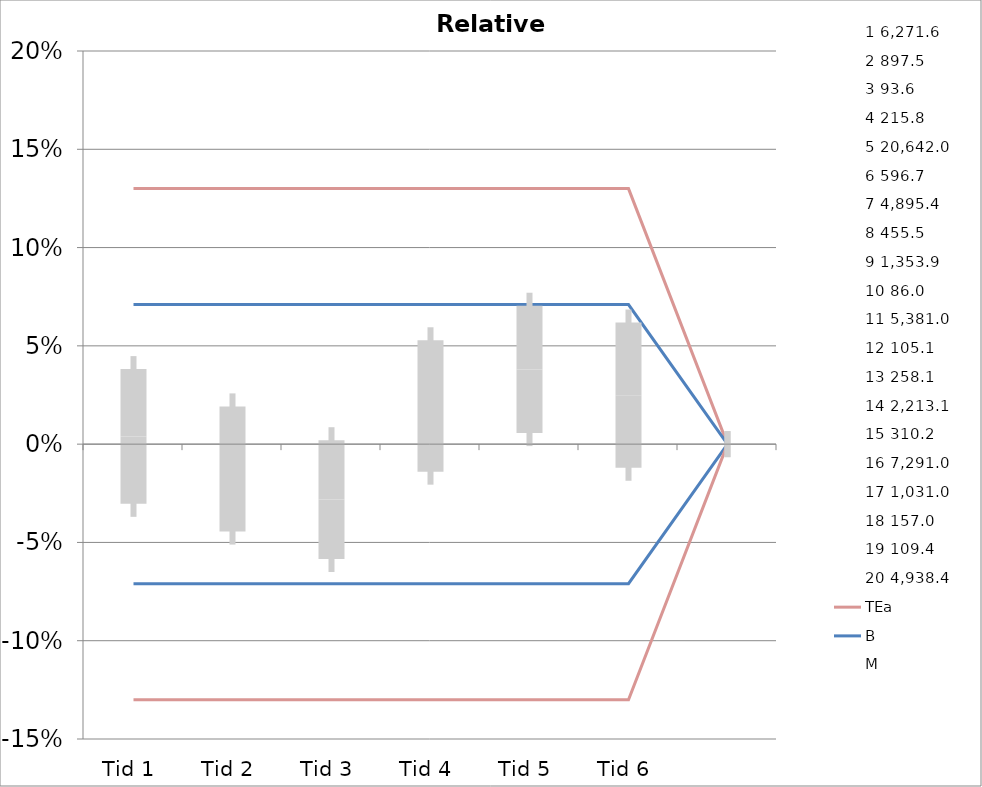
| Category | 1 | 2 | 3 | 4 | 5 | 6 | 7 | 8 | 9 | 10 | 11 | 12 | 13 | 14 | 15 | 16 | 17 | 18 | 19 | 20 | TEa | B | -B | -TEa | M |
|---|---|---|---|---|---|---|---|---|---|---|---|---|---|---|---|---|---|---|---|---|---|---|---|---|---|
| Tid 1 | 0.029 | 0.03 | 0.09 | -0.084 | 0.021 | -0.01 | -0.123 | 0.076 | -0.038 | 0.116 | 0.123 | -0.023 | -0.031 | 0 | 0 | 0.032 | -0.074 | -0.051 | 0.024 | -0.036 | 0.13 | 0.071 | -0.071 | -0.13 | 0.004 |
| Tid 2 | 0.048 | 0.023 | 0.012 | -0.097 | 0.018 | 0.019 | -0.093 | 0.048 | -0.076 | 0.116 | 0.126 | -0.037 | 0.005 | -0.096 | -0.11 | 0.005 | -0.057 | -0.004 | -0.032 | -0.069 | 0.13 | 0.071 | -0.071 | -0.13 | -0.013 |
| Tid 3 | -0.004 | -0.035 | -0.018 | -0.134 | -0.112 | 0.018 | 0 | -0.003 | 0.004 | -0.093 | 0.049 | -0.091 | -0.113 | -0.082 | -0.059 | 0.077 | -0.034 | 0.052 | 0.039 | 0.002 | 0.13 | 0.071 | -0.071 | -0.13 | -0.028 |
| Tid 4 | 0.036 | 0.066 | 0 | -0.091 | 0.01 | 0.066 | 0 | 0.043 | -0.07 | 0.095 | 0.056 | -0.096 | -0.097 | 0.004 | 0.02 | 0.087 | 0.1 | 0.051 | -0.013 | 0.083 | 0.13 | 0.071 | -0.071 | -0.13 | 0.019 |
| Tid 5 | 0.02 | -0.004 | -0.015 | 0 | 0.017 | -0.001 | 0 | 0.067 | 0.028 | 0.093 | 0.121 | -0.02 | 0 | -0.058 | -0.076 | 0.106 | 0.089 | 0.143 | 0.075 | 0.063 | 0.13 | 0.071 | -0.071 | -0.13 | 0.038 |
| Tid 6 | 0.033 | 0.014 | 0.041 | 0 | -0.043 | 0.013 | 0 | 0.115 | 0.064 | 0.129 | 0.024 | -0.061 | 0 | -0.091 | -0.069 | 0.085 | 0 | 0.132 | 0.027 | -0.014 | 0.13 | 0.071 | -0.071 | -0.13 | 0.025 |